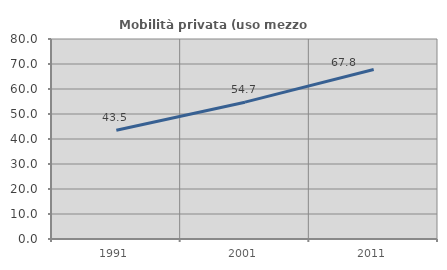
| Category | Mobilità privata (uso mezzo privato) |
|---|---|
| 1991.0 | 43.491 |
| 2001.0 | 54.734 |
| 2011.0 | 67.8 |